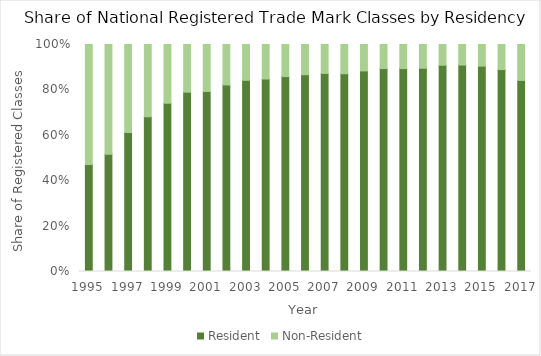
| Category | Resident | Non-Resident |
|---|---|---|
| 1995.0 | 0.471 | 0.529 |
| 1996.0 | 0.516 | 0.484 |
| 1997.0 | 0.612 | 0.388 |
| 1998.0 | 0.682 | 0.318 |
| 1999.0 | 0.741 | 0.259 |
| 2000.0 | 0.79 | 0.21 |
| 2001.0 | 0.793 | 0.207 |
| 2002.0 | 0.822 | 0.178 |
| 2003.0 | 0.842 | 0.158 |
| 2004.0 | 0.848 | 0.152 |
| 2005.0 | 0.859 | 0.141 |
| 2006.0 | 0.867 | 0.133 |
| 2007.0 | 0.873 | 0.127 |
| 2008.0 | 0.871 | 0.129 |
| 2009.0 | 0.884 | 0.116 |
| 2010.0 | 0.894 | 0.106 |
| 2011.0 | 0.894 | 0.106 |
| 2012.0 | 0.895 | 0.105 |
| 2013.0 | 0.909 | 0.091 |
| 2014.0 | 0.909 | 0.091 |
| 2015.0 | 0.905 | 0.095 |
| 2016.0 | 0.89 | 0.11 |
| 2017.0 | 0.842 | 0.158 |